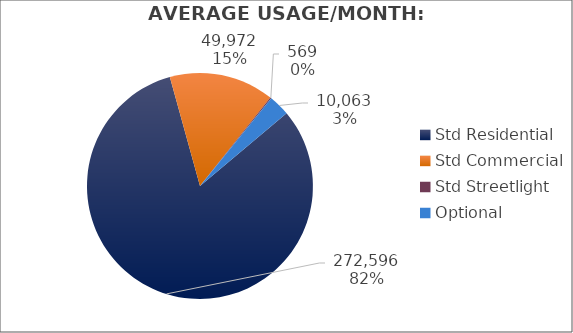
| Category | Usage |
|---|---|
| Std Residential | 272596.333 |
| Std Commercial | 49972.333 |
| Std Streetlight | 568.8 |
| Optional | 10063 |